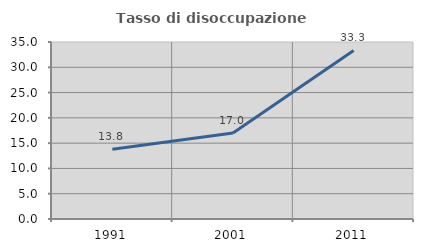
| Category | Tasso di disoccupazione giovanile  |
|---|---|
| 1991.0 | 13.793 |
| 2001.0 | 17.021 |
| 2011.0 | 33.333 |